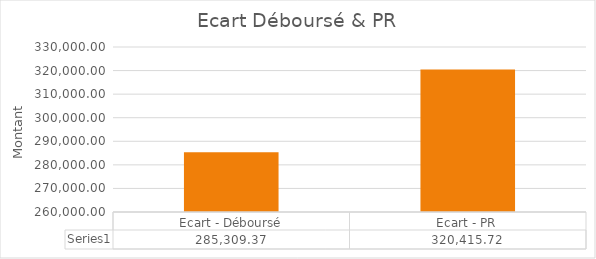
| Category | Series 0 |
|---|---|
| Ecart - Déboursé | 285309.37 |
| Ecart - PR | 320415.718 |